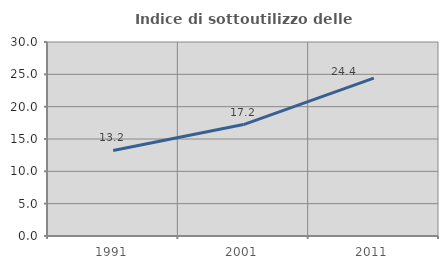
| Category | Indice di sottoutilizzo delle abitazioni  |
|---|---|
| 1991.0 | 13.223 |
| 2001.0 | 17.228 |
| 2011.0 | 24.412 |